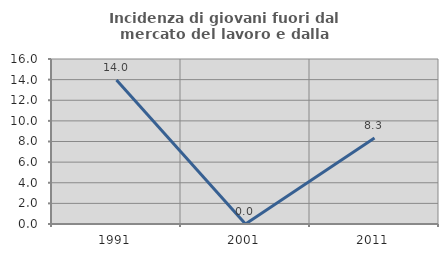
| Category | Incidenza di giovani fuori dal mercato del lavoro e dalla formazione  |
|---|---|
| 1991.0 | 13.953 |
| 2001.0 | 0 |
| 2011.0 | 8.333 |